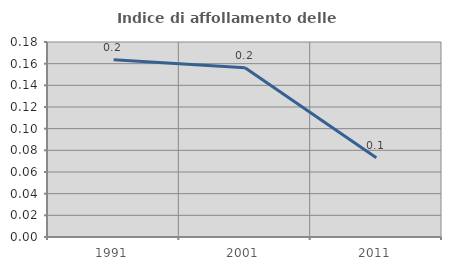
| Category | Indice di affollamento delle abitazioni  |
|---|---|
| 1991.0 | 0.164 |
| 2001.0 | 0.156 |
| 2011.0 | 0.073 |